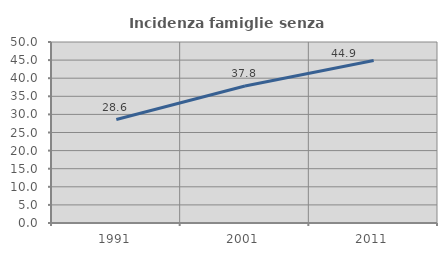
| Category | Incidenza famiglie senza nuclei |
|---|---|
| 1991.0 | 28.571 |
| 2001.0 | 37.842 |
| 2011.0 | 44.865 |